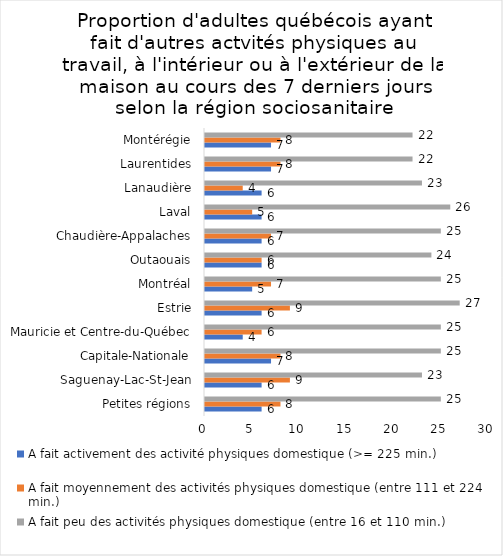
| Category | A fait activement des activité physiques domestique (>= 225 min.) | A fait moyennement des activités physiques domestique (entre 111 et 224 min.) | A fait peu des activités physiques domestique (entre 16 et 110 min.) |
|---|---|---|---|
| Petites régions | 6 | 8 | 25 |
| Saguenay-Lac-St-Jean | 6 | 9 | 23 |
| Capitale-Nationale | 7 | 8 | 25 |
| Mauricie et Centre-du-Québec | 4 | 6 | 25 |
| Estrie | 6 | 9 | 27 |
| Montréal | 5 | 7 | 25 |
| Outaouais | 6 | 6 | 24 |
| Chaudière-Appalaches | 6 | 7 | 25 |
| Laval | 6 | 5 | 26 |
| Lanaudière | 6 | 4 | 23 |
| Laurentides | 7 | 8 | 22 |
| Montérégie | 7 | 8 | 22 |